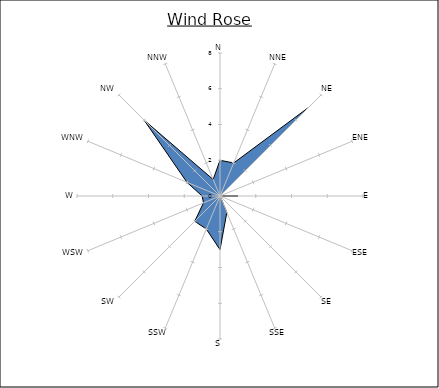
| Category | Series 0 |
|---|---|
| N | 2 |
| NNE | 2 |
| NE | 7 |
| ENE | 0 |
| E | 1 |
| ESE | 0 |
| SE | 0 |
| SSE | 1 |
| S | 3 |
| SSW | 2 |
| SW | 2 |
| WSW | 1 |
| W | 1 |
| WNW | 2 |
| NW | 6 |
| NNW | 1 |